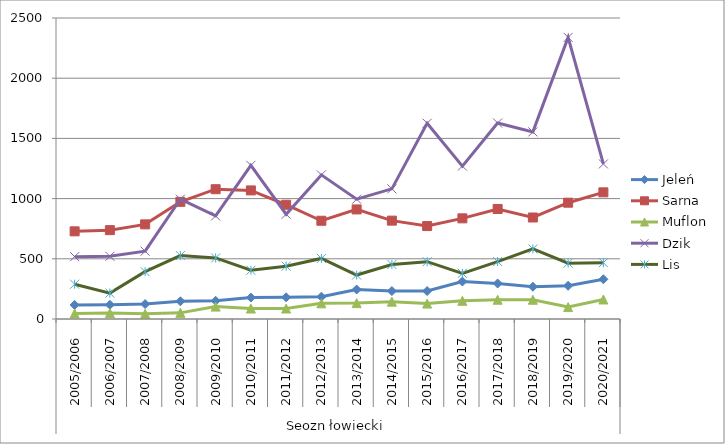
| Category | Jeleń | Sarna | Muflon | Dzik | Lis |
|---|---|---|---|---|---|
| 0 | 117 | 728 | 46 | 518 | 289 |
| 1 | 118 | 738 | 49 | 521 | 215 |
| 2 | 124 | 786 | 43 | 563 | 393 |
| 3 | 147 | 973 | 51 | 995 | 527 |
| 4 | 151 | 1078 | 103 | 856 | 507 |
| 5 | 178 | 1068 | 87 | 1276 | 405 |
| 6 | 180 | 949 | 87 | 870 | 439 |
| 7 | 185 | 816 | 130 | 1197 | 503 |
| 8 | 245 | 910 | 132 | 995 | 365 |
| 9 | 232 | 817 | 144 | 1081 | 453 |
| 10 | 232 | 772 | 128 | 1626 | 476 |
| 11 | 311 | 836 | 151 | 1270 | 379 |
| 12 | 295 | 914 | 160 | 1628 | 477 |
| 13 | 268 | 843 | 160 | 1554 | 582 |
| 14 | 276 | 966 | 99 | 2339 | 464 |
| 15 | 330 | 1052 | 162 | 1288 | 468 |